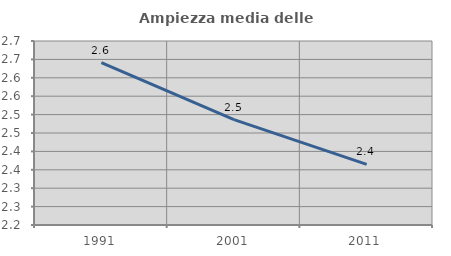
| Category | Ampiezza media delle famiglie |
|---|---|
| 1991.0 | 2.641 |
| 2001.0 | 2.486 |
| 2011.0 | 2.365 |